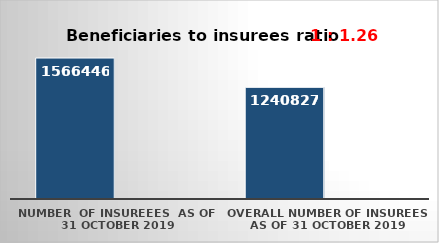
| Category | Series 0 | Series 1 |
|---|---|---|
| NUMBER  of insureees  as of  31 October 2019 | 1566446 |  |
| OVERALL number of insurees as of 31 October 2019 | 1240827 |  |